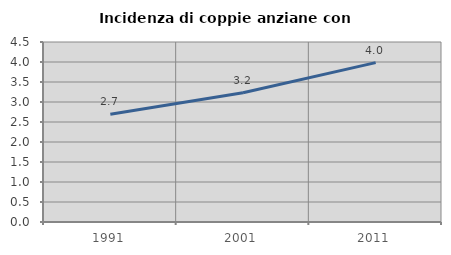
| Category | Incidenza di coppie anziane con figli |
|---|---|
| 1991.0 | 2.693 |
| 2001.0 | 3.232 |
| 2011.0 | 3.985 |